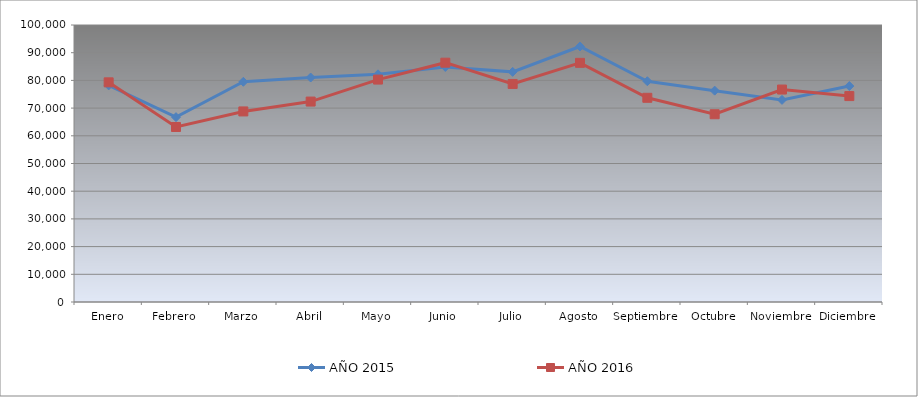
| Category | AÑO 2015 | AÑO 2016 |
|---|---|---|
| Enero | 78200 | 79300 |
| Febrero | 66740 | 63180 |
| Marzo | 79500 | 68800 |
| Abril | 81040 | 72360 |
| Mayo | 82200 | 80300 |
| Junio | 84840 | 86400 |
| Julio | 83080 | 78720 |
| Agosto | 92240 | 86340 |
| Septiembre | 79700 | 73720 |
| Octubre | 76300 | 67780 |
| Noviembre | 72960 | 76700 |
| Diciembre | 77960 | 74340 |